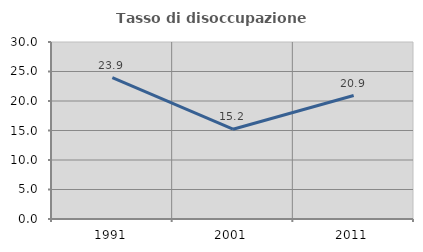
| Category | Tasso di disoccupazione giovanile  |
|---|---|
| 1991.0 | 23.944 |
| 2001.0 | 15.217 |
| 2011.0 | 20.93 |